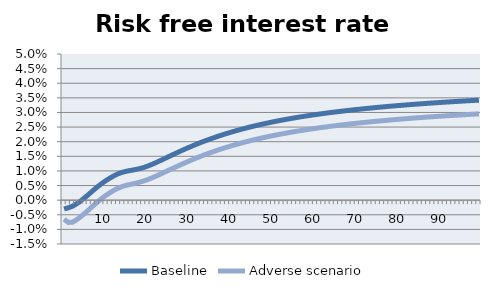
| Category | Baseline | Adverse scenario |
|---|---|---|
| nan | -0.003 | -0.007 |
| nan | -0.003 | -0.008 |
| nan | -0.002 | -0.008 |
| nan | -0.001 | -0.007 |
| nan | 0 | -0.006 |
| nan | 0.001 | -0.004 |
| nan | 0.002 | -0.003 |
| nan | 0.003 | -0.002 |
| nan | 0.005 | -0.001 |
| nan | 0.006 | 0.001 |
| 10.0 | 0.007 | 0.002 |
| nan | 0.008 | 0.003 |
| nan | 0.008 | 0.003 |
| nan | 0.009 | 0.004 |
| nan | 0.01 | 0.005 |
| nan | 0.01 | 0.005 |
| nan | 0.01 | 0.005 |
| nan | 0.01 | 0.006 |
| nan | 0.011 | 0.006 |
| nan | 0.011 | 0.007 |
| 20.0 | 0.012 | 0.007 |
| nan | 0.012 | 0.008 |
| nan | 0.013 | 0.008 |
| nan | 0.014 | 0.009 |
| nan | 0.014 | 0.01 |
| nan | 0.015 | 0.01 |
| nan | 0.016 | 0.011 |
| nan | 0.016 | 0.012 |
| nan | 0.017 | 0.012 |
| nan | 0.018 | 0.013 |
| 30.0 | 0.018 | 0.013 |
| nan | 0.019 | 0.014 |
| nan | 0.019 | 0.015 |
| nan | 0.02 | 0.015 |
| nan | 0.02 | 0.016 |
| nan | 0.021 | 0.016 |
| nan | 0.021 | 0.017 |
| nan | 0.022 | 0.017 |
| nan | 0.022 | 0.018 |
| nan | 0.023 | 0.018 |
| 40.0 | 0.023 | 0.019 |
| nan | 0.024 | 0.019 |
| nan | 0.024 | 0.019 |
| nan | 0.025 | 0.02 |
| nan | 0.025 | 0.02 |
| nan | 0.025 | 0.021 |
| nan | 0.026 | 0.021 |
| nan | 0.026 | 0.021 |
| nan | 0.026 | 0.022 |
| nan | 0.027 | 0.022 |
| 50.0 | 0.027 | 0.022 |
| nan | 0.027 | 0.022 |
| nan | 0.027 | 0.023 |
| nan | 0.028 | 0.023 |
| nan | 0.028 | 0.023 |
| nan | 0.028 | 0.023 |
| nan | 0.028 | 0.024 |
| nan | 0.029 | 0.024 |
| nan | 0.029 | 0.024 |
| nan | 0.029 | 0.024 |
| 60.0 | 0.029 | 0.025 |
| nan | 0.029 | 0.025 |
| nan | 0.03 | 0.025 |
| nan | 0.03 | 0.025 |
| nan | 0.03 | 0.025 |
| nan | 0.03 | 0.026 |
| nan | 0.03 | 0.026 |
| nan | 0.031 | 0.026 |
| nan | 0.031 | 0.026 |
| nan | 0.031 | 0.026 |
| 70.0 | 0.031 | 0.026 |
| nan | 0.031 | 0.026 |
| nan | 0.031 | 0.027 |
| nan | 0.031 | 0.027 |
| nan | 0.032 | 0.027 |
| nan | 0.032 | 0.027 |
| nan | 0.032 | 0.027 |
| nan | 0.032 | 0.027 |
| nan | 0.032 | 0.027 |
| nan | 0.032 | 0.028 |
| 80.0 | 0.032 | 0.028 |
| nan | 0.032 | 0.028 |
| nan | 0.033 | 0.028 |
| nan | 0.033 | 0.028 |
| nan | 0.033 | 0.028 |
| nan | 0.033 | 0.028 |
| nan | 0.033 | 0.028 |
| nan | 0.033 | 0.028 |
| nan | 0.033 | 0.029 |
| nan | 0.033 | 0.029 |
| 90.0 | 0.033 | 0.029 |
| nan | 0.034 | 0.029 |
| nan | 0.034 | 0.029 |
| nan | 0.034 | 0.029 |
| nan | 0.034 | 0.029 |
| nan | 0.034 | 0.029 |